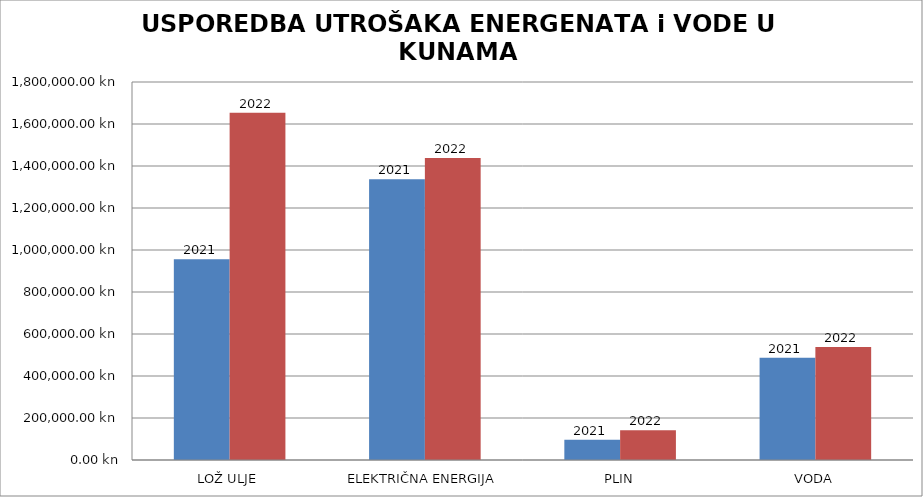
| Category | 2021 | 2022 |
|---|---|---|
| LOŽ ULJE | 955874.33 | 1653478.05 |
| ELEKTRIČNA ENERGIJA | 1337431.45 | 1438064.78 |
| PLIN | 96233.32 | 141829.84 |
| VODA | 487430.37 | 538293.2 |